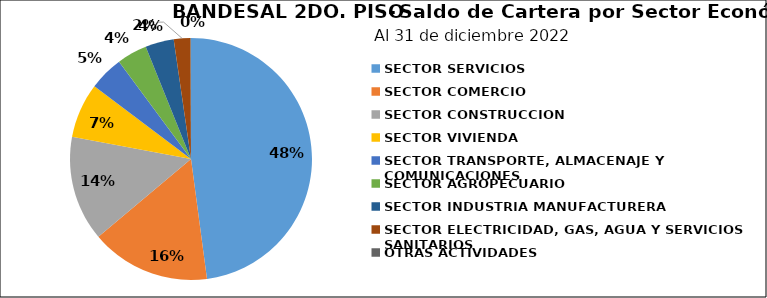
| Category | Saldo | Créditos |
|---|---|---|
| SECTOR SERVICIOS | 202.732 | 4043 |
| SECTOR COMERCIO | 67.665 | 3227 |
| SECTOR CONSTRUCCION | 59.566 | 1626 |
| SECTOR VIVIENDA | 31.077 | 2103 |
| SECTOR TRANSPORTE, ALMACENAJE Y COMUNICACIONES | 19.38 | 959 |
| SECTOR AGROPECUARIO | 17.085 | 519 |
| SECTOR INDUSTRIA MANUFACTURERA | 16.136 | 247 |
| SECTOR ELECTRICIDAD, GAS, AGUA Y SERVICIOS SANITARIOS | 9.423 | 34 |
| OTRAS ACTIVIDADES | 0.267 | 14 |